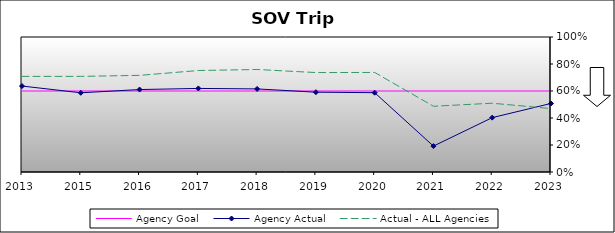
| Category | Agency Goal | Agency Actual | Actual - ALL Agencies |
|---|---|---|---|
| 2013.0 | 0.6 | 0.637 | 0.708 |
| 2015.0 | 0.6 | 0.587 | 0.708 |
| 2016.0 | 0.6 | 0.611 | 0.716 |
| 2017.0 | 0.6 | 0.619 | 0.752 |
| 2018.0 | 0.6 | 0.616 | 0.759 |
| 2019.0 | 0.6 | 0.591 | 0.736 |
| 2020.0 | 0.6 | 0.588 | 0.737 |
| 2021.0 | 0.6 | 0.192 | 0.487 |
| 2022.0 | 0.6 | 0.403 | 0.509 |
| 2023.0 | 0.6 | 0.508 | 0.47 |